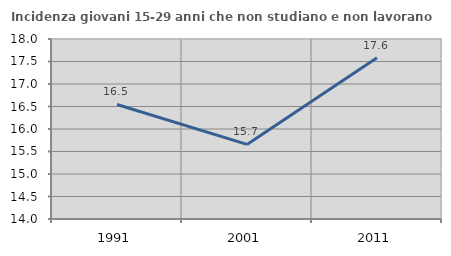
| Category | Incidenza giovani 15-29 anni che non studiano e non lavorano  |
|---|---|
| 1991.0 | 16.545 |
| 2001.0 | 15.658 |
| 2011.0 | 17.585 |